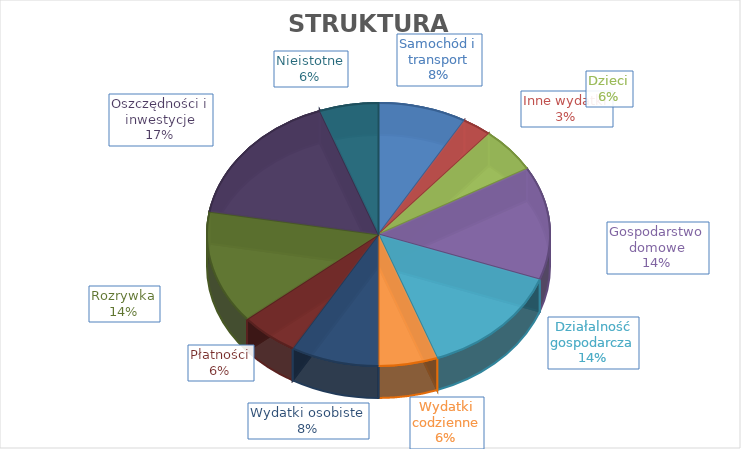
| Category | Series 0 |
|---|---|
| Samochód i transport | 3 |
| Inne wydatki | 1 |
| Dzieci | 2 |
| Gospodarstwo domowe | 5 |
| Działalność gospodarcza | 5 |
| Wydatki codzienne | 2 |
| Wydatki osobiste | 3 |
| Płatności | 2 |
| Rozrywka | 5 |
| Oszczędności i inwestycje | 6 |
| Nieistotne | 2 |